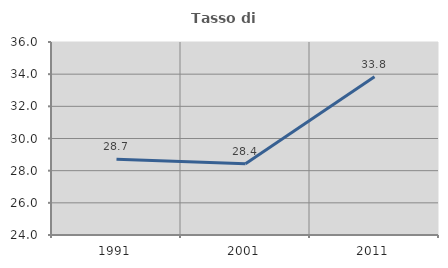
| Category | Tasso di occupazione   |
|---|---|
| 1991.0 | 28.704 |
| 2001.0 | 28.429 |
| 2011.0 | 33.844 |